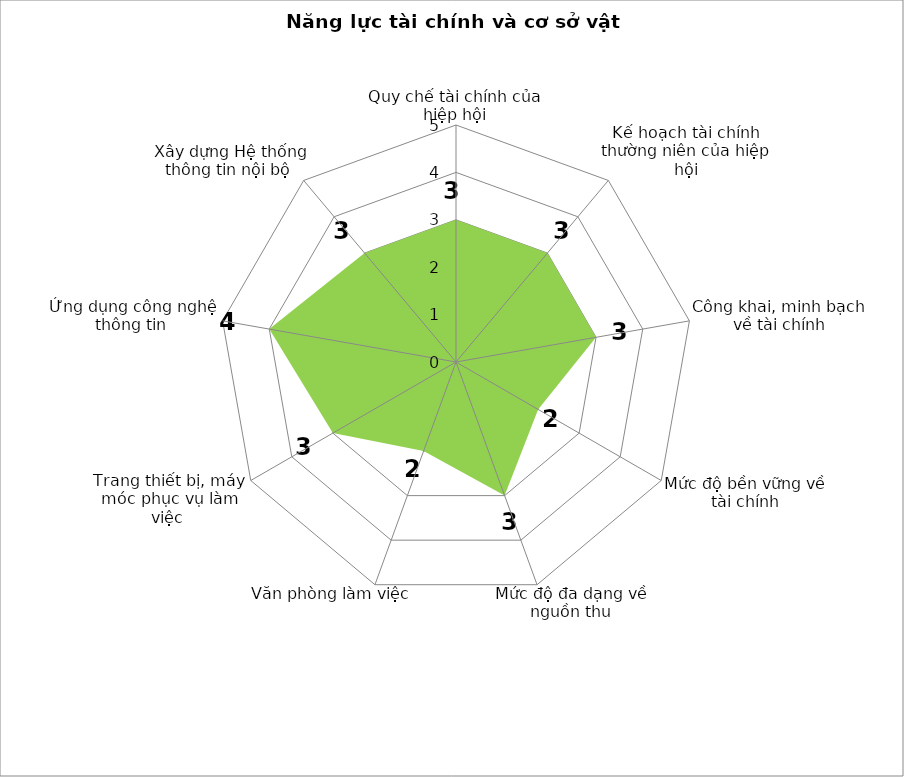
| Category | Series 0 |
|---|---|
| Quy chế tài chính của hiệp hội | 3 |
| Kế hoạch tài chính thường niên của hiệp hội | 3 |
| Công khai, minh bạch về tài chính | 3 |
| Mức độ bền vững về tài chính | 2 |
| Mức độ đa dạng về nguồn thu | 3 |
| Văn phòng làm việc  | 2 |
| Trang thiết bị, máy móc phục vụ làm việc  | 3 |
| Ứng dụng công nghệ thông tin  | 4 |
| Xây dựng Hệ thống thông tin nội bộ  | 3 |